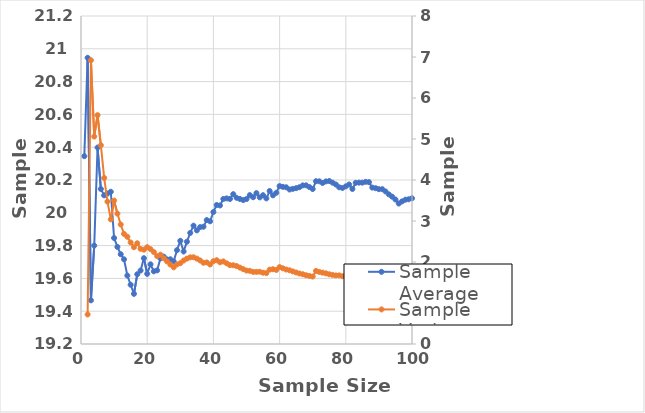
| Category | Sample Average |
|---|---|
| 1.0 | 20.345 |
| 2.0 | 20.945 |
| 3.0 | 19.466 |
| 4.0 | 19.8 |
| 5.0 | 20.398 |
| 6.0 | 20.145 |
| 7.0 | 20.106 |
| 8.0 | 20.117 |
| 9.0 | 20.128 |
| 10.0 | 19.846 |
| 11.0 | 19.792 |
| 12.0 | 19.747 |
| 13.0 | 19.716 |
| 14.0 | 19.617 |
| 15.0 | 19.561 |
| 16.0 | 19.506 |
| 17.0 | 19.626 |
| 18.0 | 19.648 |
| 19.0 | 19.723 |
| 20.0 | 19.628 |
| 21.0 | 19.686 |
| 22.0 | 19.643 |
| 23.0 | 19.649 |
| 24.0 | 19.722 |
| 25.0 | 19.733 |
| 26.0 | 19.716 |
| 27.0 | 19.717 |
| 28.0 | 19.703 |
| 29.0 | 19.772 |
| 30.0 | 19.829 |
| 31.0 | 19.764 |
| 32.0 | 19.824 |
| 33.0 | 19.877 |
| 34.0 | 19.921 |
| 35.0 | 19.893 |
| 36.0 | 19.913 |
| 37.0 | 19.915 |
| 38.0 | 19.956 |
| 39.0 | 19.948 |
| 40.0 | 20.005 |
| 41.0 | 20.048 |
| 42.0 | 20.045 |
| 43.0 | 20.084 |
| 44.0 | 20.088 |
| 45.0 | 20.084 |
| 46.0 | 20.114 |
| 47.0 | 20.091 |
| 48.0 | 20.084 |
| 49.0 | 20.078 |
| 50.0 | 20.084 |
| 51.0 | 20.108 |
| 52.0 | 20.095 |
| 53.0 | 20.12 |
| 54.0 | 20.094 |
| 55.0 | 20.107 |
| 56.0 | 20.088 |
| 57.0 | 20.133 |
| 58.0 | 20.106 |
| 59.0 | 20.122 |
| 60.0 | 20.163 |
| 61.0 | 20.158 |
| 62.0 | 20.156 |
| 63.0 | 20.142 |
| 64.0 | 20.146 |
| 65.0 | 20.15 |
| 66.0 | 20.156 |
| 67.0 | 20.167 |
| 68.0 | 20.167 |
| 69.0 | 20.157 |
| 70.0 | 20.145 |
| 71.0 | 20.193 |
| 72.0 | 20.192 |
| 73.0 | 20.182 |
| 74.0 | 20.191 |
| 75.0 | 20.194 |
| 76.0 | 20.184 |
| 77.0 | 20.173 |
| 78.0 | 20.156 |
| 79.0 | 20.152 |
| 80.0 | 20.161 |
| 81.0 | 20.173 |
| 82.0 | 20.145 |
| 83.0 | 20.183 |
| 84.0 | 20.184 |
| 85.0 | 20.184 |
| 86.0 | 20.189 |
| 87.0 | 20.187 |
| 88.0 | 20.154 |
| 89.0 | 20.15 |
| 90.0 | 20.144 |
| 91.0 | 20.144 |
| 92.0 | 20.13 |
| 93.0 | 20.112 |
| 94.0 | 20.098 |
| 95.0 | 20.081 |
| 96.0 | 20.056 |
| 97.0 | 20.07 |
| 98.0 | 20.08 |
| 99.0 | 20.083 |
| 100.0 | 20.089 |